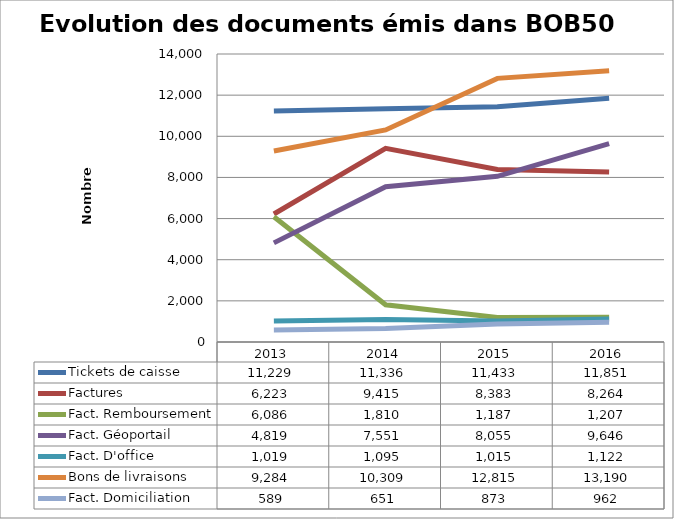
| Category | Tickets de caisse | Factures | Fact. Remboursement | Fact. Géoportail | Fact. D'office | Bons de livraisons | Fact. Domiciliation |
|---|---|---|---|---|---|---|---|
| 2013.0 | 11229 | 6223 | 6086 | 4819 | 1019 | 9284 | 589 |
| 2014.0 | 11336 | 9415 | 1810 | 7551 | 1095 | 10309 | 651 |
| 2015.0 | 11433 | 8383 | 1187 | 8055 | 1015 | 12815 | 873 |
| 2016.0 | 11851 | 8264 | 1207 | 9646 | 1122 | 13190 | 962 |